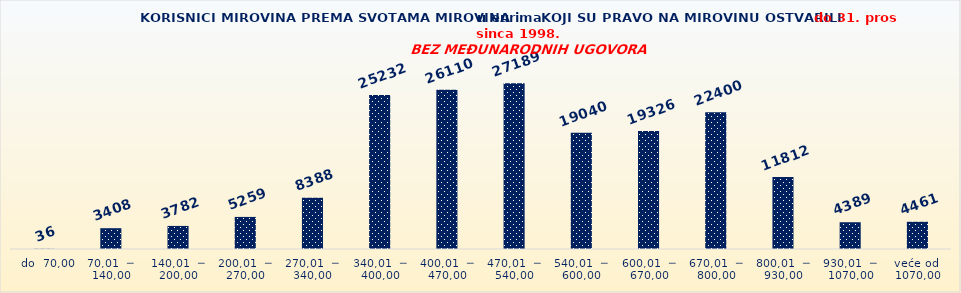
| Category | Series 0 |
|---|---|
|   do  70,00 | 36 |
| 70,01  ─  140,00 | 3408 |
| 140,01  ─  200,00 | 3782 |
| 200,01  ─  270,00 | 5259 |
| 270,01  ─  340,00 | 8388 |
| 340,01  ─  400,00 | 25232 |
| 400,01  ─  470,00 | 26110 |
| 470,01  ─  540,00 | 27189 |
| 540,01  ─  600,00 | 19040 |
| 600,01  ─  670,00 | 19326 |
| 670,01  ─  800,00 | 22400 |
| 800,01  ─  930,00 | 11812 |
| 930,01  ─  1070,00 | 4389 |
| veće od  1070,00 | 4461 |